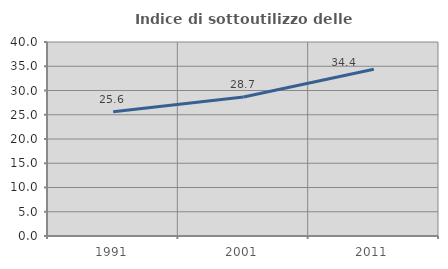
| Category | Indice di sottoutilizzo delle abitazioni  |
|---|---|
| 1991.0 | 25.62 |
| 2001.0 | 28.678 |
| 2011.0 | 34.389 |